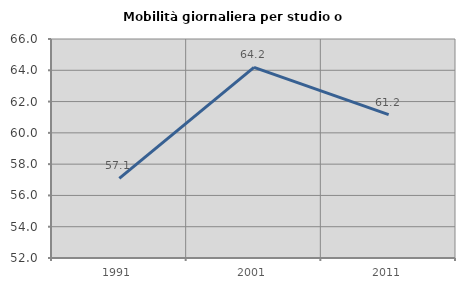
| Category | Mobilità giornaliera per studio o lavoro |
|---|---|
| 1991.0 | 57.087 |
| 2001.0 | 64.187 |
| 2011.0 | 61.163 |